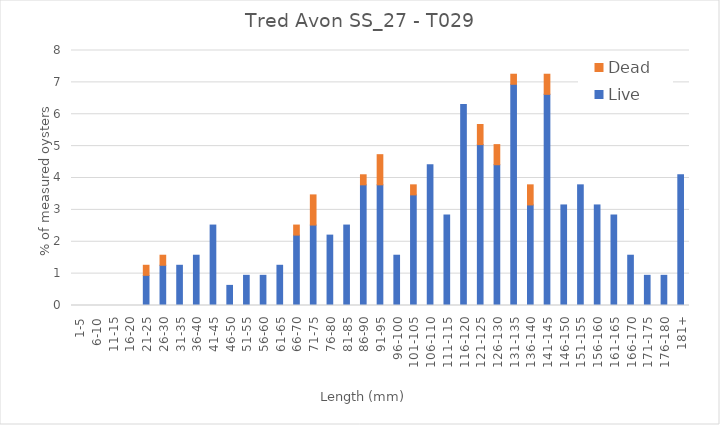
| Category | Live | Dead |
|---|---|---|
| 1-5 | 0 | 0 |
| 6-10 | 0 | 0 |
| 11-15 | 0 | 0 |
| 16-20 | 0 | 0 |
| 21-25 | 0.946 | 0.315 |
| 26-30 | 1.262 | 0.315 |
| 31-35 | 1.262 | 0 |
| 36-40 | 1.577 | 0 |
| 41-45 | 2.524 | 0 |
| 46-50 | 0.631 | 0 |
| 51-55 | 0.946 | 0 |
| 56-60 | 0.946 | 0 |
| 61-65 | 1.262 | 0 |
| 66-70 | 2.208 | 0.315 |
| 71-75 | 2.524 | 0.946 |
| 76-80 | 2.208 | 0 |
| 81-85 | 2.524 | 0 |
| 86-90 | 3.785 | 0.315 |
| 91-95 | 3.785 | 0.946 |
| 96-100 | 1.577 | 0 |
| 101-105 | 3.47 | 0.315 |
| 106-110 | 4.416 | 0 |
| 111-115 | 2.839 | 0 |
| 116-120 | 6.309 | 0 |
| 121-125 | 5.047 | 0.631 |
| 126-130 | 4.416 | 0.631 |
| 131-135 | 6.94 | 0.315 |
| 136-140 | 3.155 | 0.631 |
| 141-145 | 6.625 | 0.631 |
| 146-150 | 3.155 | 0 |
| 151-155 | 3.785 | 0 |
| 156-160 | 3.155 | 0 |
| 161-165 | 2.839 | 0 |
| 166-170 | 1.577 | 0 |
| 171-175 | 0.946 | 0 |
| 176-180 | 0.946 | 0 |
| 181+ | 4.101 | 0 |